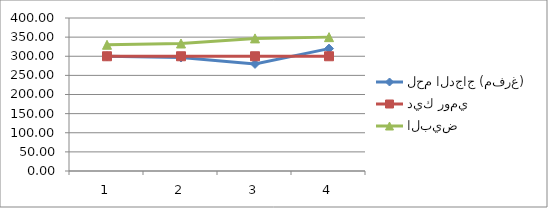
| Category | لحم الدجاج (مفرغ) | ديك رومي | البيض |
|---|---|---|---|
| 0 | 300 | 300 | 330 |
| 1 | 296.67 | 300 | 333.33 |
| 2 | 280 | 300 | 346.67 |
| 3 | 320 | 300 | 350 |